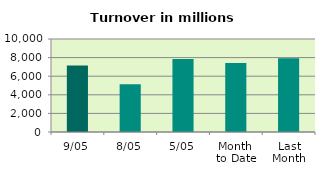
| Category | Series 0 |
|---|---|
| 9/05 | 7156.422 |
| 8/05 | 5143.543 |
| 5/05 | 7844.807 |
| Month 
to Date | 7415.438 |
| Last
Month | 7939.051 |